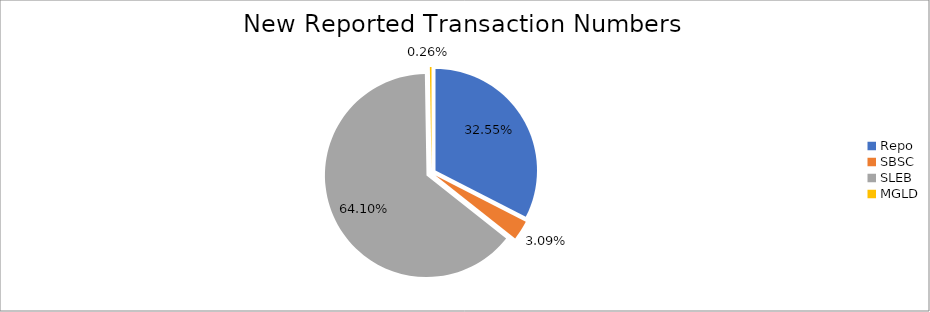
| Category | Series 0 |
|---|---|
| Repo | 452787 |
| SBSC | 42956 |
| SLEB | 891719 |
| MGLD | 3600 |